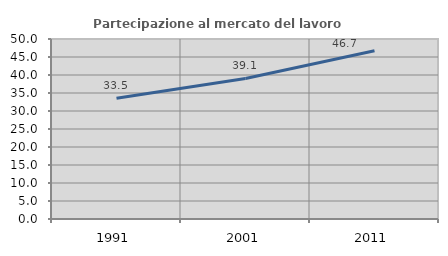
| Category | Partecipazione al mercato del lavoro  femminile |
|---|---|
| 1991.0 | 33.516 |
| 2001.0 | 39.053 |
| 2011.0 | 46.723 |